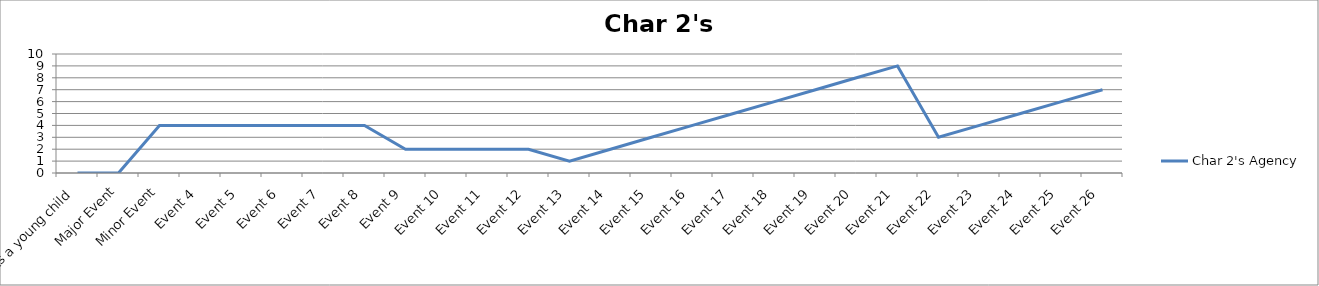
| Category | Char 2's Agency |
|---|---|
| As a young child | 0 |
| Major Event | 0 |
| Minor Event | 4 |
| Event 4 | 4 |
| Event 5 | 4 |
| Event 6 | 4 |
| Event 7 | 4 |
| Event 8 | 4 |
| Event 9 | 2 |
| Event 10 | 2 |
| Event 11 | 2 |
| Event 12 | 2 |
| Event 13 | 1 |
| Event 14 | 2 |
| Event 15 | 3 |
| Event 16 | 4 |
| Event 17 | 5 |
| Event 18 | 6 |
| Event 19 | 7 |
| Event 20 | 8 |
| Event 21 | 9 |
| Event 22 | 3 |
| Event 23 | 4 |
| Event 24 | 5 |
| Event 25 | 6 |
| Event 26 | 7 |